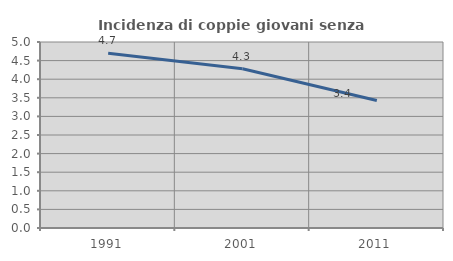
| Category | Incidenza di coppie giovani senza figli |
|---|---|
| 1991.0 | 4.7 |
| 2001.0 | 4.279 |
| 2011.0 | 3.429 |